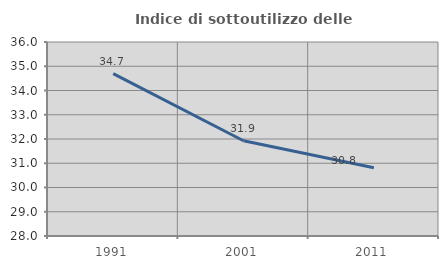
| Category | Indice di sottoutilizzo delle abitazioni  |
|---|---|
| 1991.0 | 34.694 |
| 2001.0 | 31.928 |
| 2011.0 | 30.814 |